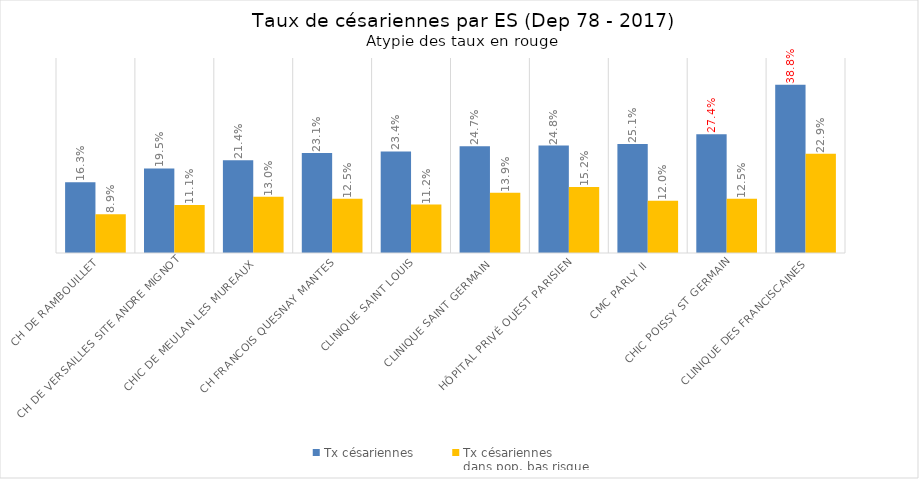
| Category | Tx césariennes | Tx césariennes 
dans pop. bas risque |
|---|---|---|
| CH DE RAMBOUILLET | 0.163 | 0.089 |
| CH DE VERSAILLES SITE ANDRE MIGNOT | 0.195 | 0.111 |
| CHIC DE MEULAN LES MUREAUX | 0.214 | 0.13 |
| CH FRANCOIS QUESNAY MANTES | 0.231 | 0.125 |
| CLINIQUE SAINT LOUIS | 0.234 | 0.112 |
| CLINIQUE SAINT GERMAIN | 0.247 | 0.139 |
| HÔPITAL PRIVÉ OUEST PARISIEN | 0.248 | 0.152 |
| CMC PARLY II | 0.251 | 0.12 |
| CHIC POISSY ST GERMAIN | 0.274 | 0.125 |
| CLINIQUE DES FRANCISCAINES | 0.388 | 0.229 |